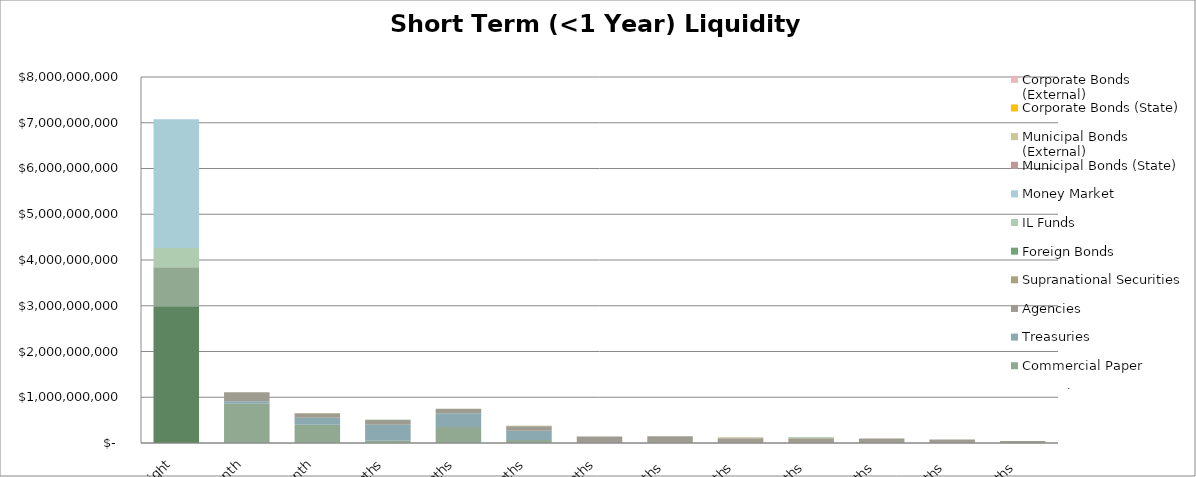
| Category | Repurchase Agreements | Commercial Paper | Treasuries | Agencies | Supranational Securities | Foreign Bonds | IL Funds | Money Market | Municipal Bonds (State) | Municipal Bonds (External) | Corporate Bonds (State) | Corporate Bonds (External) |
|---|---|---|---|---|---|---|---|---|---|---|---|---|
| Overnight | 2989000000 | 850000000 | 0 | 0 | 0 | 0 | 425000000 | 2810000000 | 0 | 0 | 0 | 0 |
| 1 Month | 0 | 860575000 | 50000000 | 200000000 | 0 | 0 | 0 | 0 | 0 | 860000 | 0 | 0 |
| 2 Month | 0 | 400000000 | 150000000 | 96000000 | 10000000 | 0 | 0 | 0 | 0 | 0 | 0 | 0 |
| 3 Months | 0 | 50000000 | 350000000 | 100001000 | 0 | 10000000 | 0 | 0 | 0 | 0 | 0 | 0 |
| 4 Months | 0 | 350000000 | 300000000 | 100000000 | 0 | 0 | 0 | 0 | 0 | 0 | 0 | 0 |
| 5 Months | 0 | 65770000 | 200000000 | 100000000 | 10000000 | 0 | 0 | 0 | 0 | 0 | 0 | 0 |
| 6 Months | 0 | 0 | 0 | 140000000 | 0 | 0 | 0 | 0 | 0 | 0 | 0 | 0 |
| 7 Months  | 0 | 0 | 0 | 150000000 | 0 | 0 | 0 | 0 | 0 | 0 | 0 | 0 |
| 8 Months  | 0 | 0 | 0 | 100000000 | 20000000 | 0 | 0 | 0 | 0 | 0 | 0 | 0 |
| 9 Months  | 0 | 0 | 0 | 100000000 | 10000000 | 10000000 | 0 | 0 | 0 | 0 | 0 | 0 |
| 10 Months  | 0 | 0 | 0 | 100000000 | 0 | 0 | 0 | 0 | 0 | 0 | 0 | 0 |
| 11 Months  | 0 | 0 | 0 | 75000000 | 0 | 0 | 0 | 0 | 0 | 0 | 0 | 0 |
| 12 Months  | 0 | 0 | 0 | 45000000 | 0 | 0 | 0 | 0 | 0 | 0 | 0 | 0 |